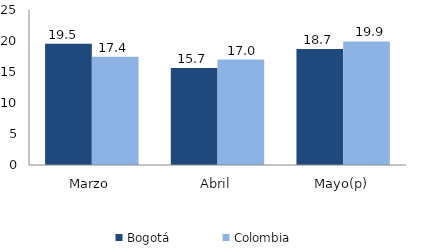
| Category | Bogotá | Colombia |
|---|---|---|
| Marzo | 19.547 | 17.441 |
| Abril | 15.657 | 17.011 |
| Mayo(p) | 18.714 | 19.93 |